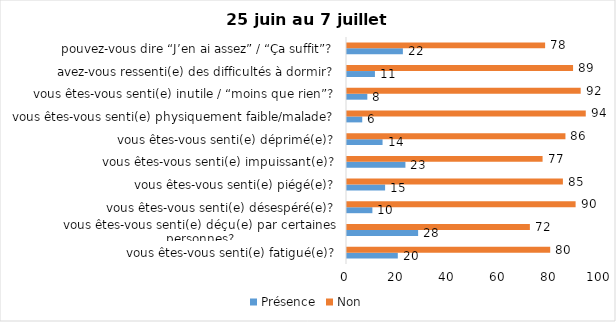
| Category | Présence | Non |
|---|---|---|
| vous êtes-vous senti(e) fatigué(e)? | 20 | 80 |
| vous êtes-vous senti(e) déçu(e) par certaines personnes? | 28 | 72 |
| vous êtes-vous senti(e) désespéré(e)? | 10 | 90 |
| vous êtes-vous senti(e) piégé(e)? | 15 | 85 |
| vous êtes-vous senti(e) impuissant(e)? | 23 | 77 |
| vous êtes-vous senti(e) déprimé(e)? | 14 | 86 |
| vous êtes-vous senti(e) physiquement faible/malade? | 6 | 94 |
| vous êtes-vous senti(e) inutile / “moins que rien”? | 8 | 92 |
| avez-vous ressenti(e) des difficultés à dormir? | 11 | 89 |
| pouvez-vous dire “J’en ai assez” / “Ça suffit”? | 22 | 78 |